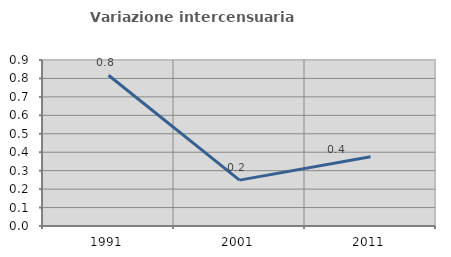
| Category | Variazione intercensuaria annua |
|---|---|
| 1991.0 | 0.817 |
| 2001.0 | 0.249 |
| 2011.0 | 0.376 |